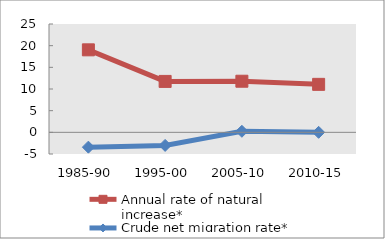
| Category | Annual rate of natural increase* | Crude net migration rate* |
|---|---|---|
| 1985-90 | 19.038 | -3.42 |
| 1995-00 | 11.749 | -3.016 |
| 2005-10 | 11.795 | 0.241 |
| 2010-15 | 11.073 | 0 |